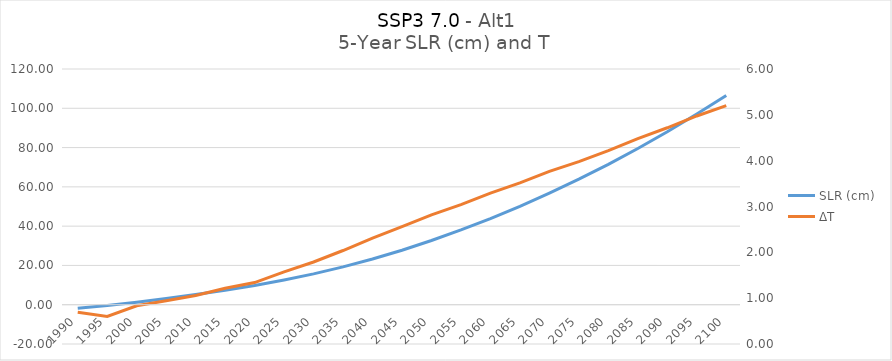
| Category | SLR (cm) |
|---|---|
| 1990.0 | -1.781 |
| 1995.0 | -0.455 |
| 2000.0 | 1.253 |
| 2005.0 | 3.132 |
| 2010.0 | 5.16 |
| 2015.0 | 7.412 |
| 2020.0 | 9.814 |
| 2025.0 | 12.59 |
| 2030.0 | 15.709 |
| 2035.0 | 19.254 |
| 2040.0 | 23.278 |
| 2045.0 | 27.752 |
| 2050.0 | 32.707 |
| 2055.0 | 38.056 |
| 2060.0 | 43.878 |
| 2065.0 | 50.106 |
| 2070.0 | 56.818 |
| 2075.0 | 63.914 |
| 2080.0 | 71.46 |
| 2085.0 | 79.523 |
| 2090.0 | 88.043 |
| 2095.0 | 97.077 |
| 2100.0 | 106.541 |